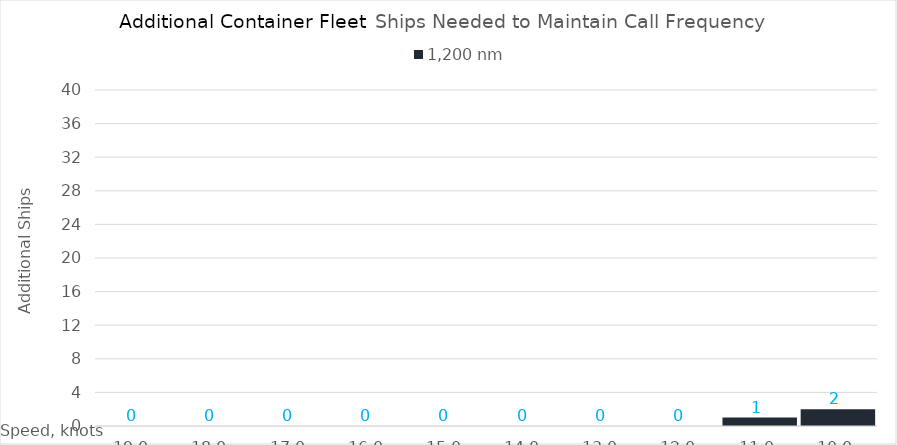
| Category | 1,200 |
|---|---|
| 19.0 | 0 |
| 18.0 | 0 |
| 17.0 | 0 |
| 16.0 | 0 |
| 15.0 | 0 |
| 14.0 | 0 |
| 13.0 | 0 |
| 12.0 | 0 |
| 11.0 | 1 |
| 10.0 | 2 |